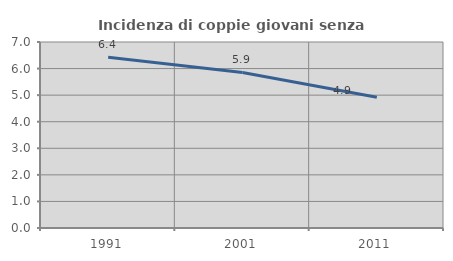
| Category | Incidenza di coppie giovani senza figli |
|---|---|
| 1991.0 | 6.422 |
| 2001.0 | 5.855 |
| 2011.0 | 4.923 |